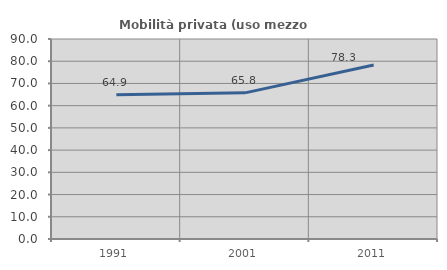
| Category | Mobilità privata (uso mezzo privato) |
|---|---|
| 1991.0 | 64.876 |
| 2001.0 | 65.766 |
| 2011.0 | 78.31 |